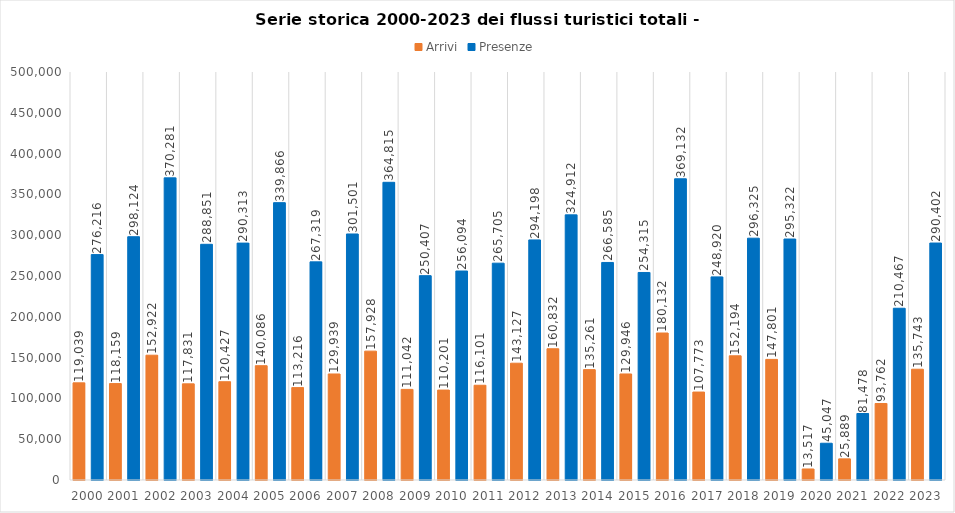
| Category | Arrivi | Presenze |
|---|---|---|
| 2000.0 | 119039 | 276216 |
| 2001.0 | 118159 | 298124 |
| 2002.0 | 152922 | 370281 |
| 2003.0 | 117831 | 288851 |
| 2004.0 | 120427 | 290313 |
| 2005.0 | 140086 | 339866 |
| 2006.0 | 113216 | 267319 |
| 2007.0 | 129939 | 301501 |
| 2008.0 | 157928 | 364815 |
| 2009.0 | 111042 | 250407 |
| 2010.0 | 110201 | 256094 |
| 2011.0 | 116101 | 265705 |
| 2012.0 | 143127 | 294198 |
| 2013.0 | 160832 | 324912 |
| 2014.0 | 135261 | 266585 |
| 2015.0 | 129946 | 254315 |
| 2016.0 | 180132 | 369132 |
| 2017.0 | 107773 | 248920 |
| 2018.0 | 152194 | 296325 |
| 2019.0 | 147801 | 295322 |
| 2020.0 | 13517 | 45047 |
| 2021.0 | 25889 | 81478 |
| 2022.0 | 93762 | 210467 |
| 2023.0 | 135743 | 290402 |